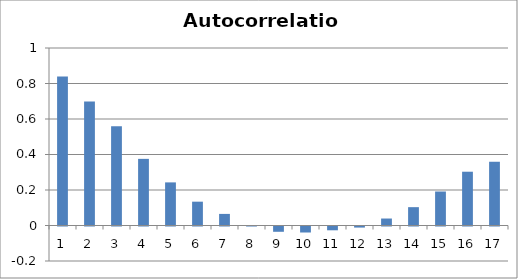
| Category | Series 0 |
|---|---|
| 0 | 0.839 |
| 1 | 0.698 |
| 2 | 0.559 |
| 3 | 0.375 |
| 4 | 0.243 |
| 5 | 0.134 |
| 6 | 0.065 |
| 7 | 0.001 |
| 8 | -0.03 |
| 9 | -0.034 |
| 10 | -0.021 |
| 11 | -0.006 |
| 12 | 0.039 |
| 13 | 0.103 |
| 14 | 0.192 |
| 15 | 0.303 |
| 16 | 0.359 |